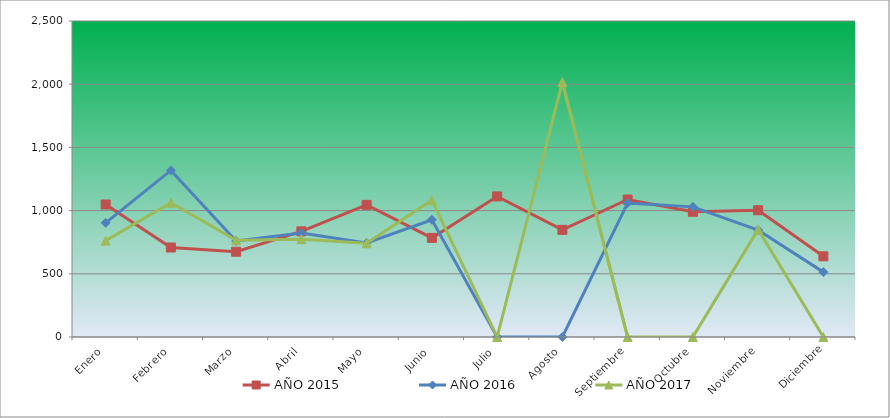
| Category | AÑO 2015 | AÑO 2016 | AÑO 2017 |
|---|---|---|---|
| Enero | 1048.353 | 903.487 | 762.227 |
| Febrero | 708.018 | 1317.711 | 1061.78 |
| Marzo | 674.592 | 759.41 | 765.193 |
| Abril | 835.644 | 822.444 | 774.091 |
| Mayo | 1045.314 | 744.402 | 741.466 |
| Junio | 783.986 | 927.5 | 1082.541 |
| Julio | 1112.166 | 0 | 0 |
| Agosto | 847.798 | 0 | 2016.788 |
| Septiembre | 1087.856 | 1059.572 | 0 |
| Octubre | 990.617 | 1029.556 | 0 |
| Noviembre | 1002.772 | 846.457 | 851.203 |
| Diciembre | 638.128 | 513.277 | 0 |